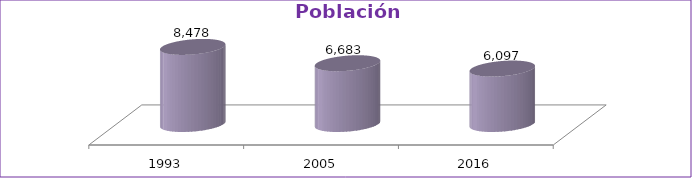
| Category | Población Total |
|---|---|
| 1993 | 8478 |
| 2005 | 6683 |
| 2016 | 6097 |